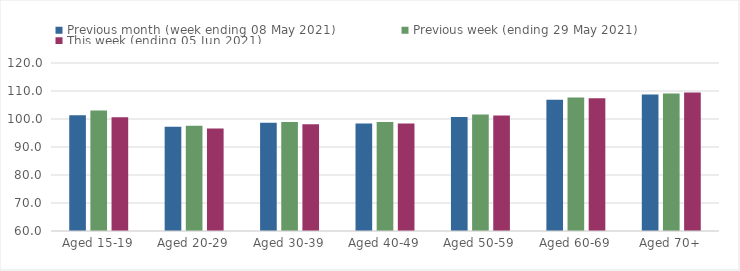
| Category | Previous month (week ending 08 May 2021) | Previous week (ending 29 May 2021) | This week (ending 05 Jun 2021) |
|---|---|---|---|
| Aged 15-19 | 101.32 | 103.01 | 100.6 |
| Aged 20-29 | 97.21 | 97.61 | 96.63 |
| Aged 30-39 | 98.64 | 98.94 | 98.14 |
| Aged 40-49 | 98.4 | 98.92 | 98.39 |
| Aged 50-59 | 100.75 | 101.65 | 101.24 |
| Aged 60-69 | 106.88 | 107.66 | 107.41 |
| Aged 70+ | 108.72 | 109.14 | 109.47 |